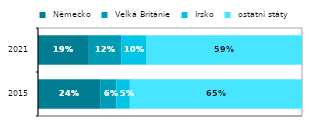
| Category |  Německo |  Velká Británie |  Irsko |  ostatní státy |
|---|---|---|---|---|
|  2015 | 0.235 | 0.062 | 0.051 | 0.652 |
| 2021 | 0.193 | 0.122 | 0.096 | 0.588 |